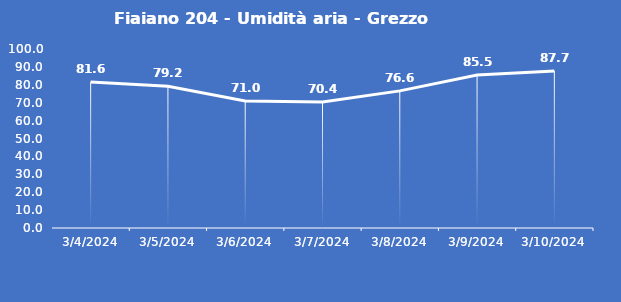
| Category | Fiaiano 204 - Umidità aria - Grezzo (%) |
|---|---|
| 3/4/24 | 81.6 |
| 3/5/24 | 79.2 |
| 3/6/24 | 71 |
| 3/7/24 | 70.4 |
| 3/8/24 | 76.6 |
| 3/9/24 | 85.5 |
| 3/10/24 | 87.7 |